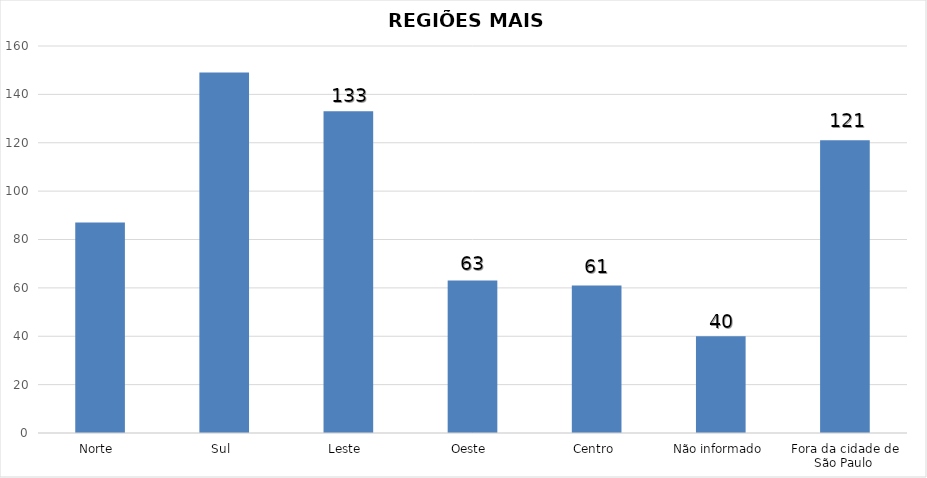
| Category | Series 0 |
|---|---|
| Norte  | 87 |
| Sul  | 149 |
| Leste  | 133 |
| Oeste  | 63 |
| Centro  | 61 |
| Não informado  | 40 |
| Fora da cidade de São Paulo  | 121 |